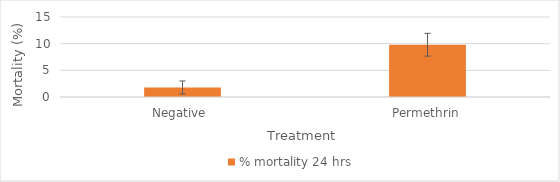
| Category | % mortality 24 hrs |
|---|---|
| Negative  | 1.786 |
| Permethrin | 9.804 |